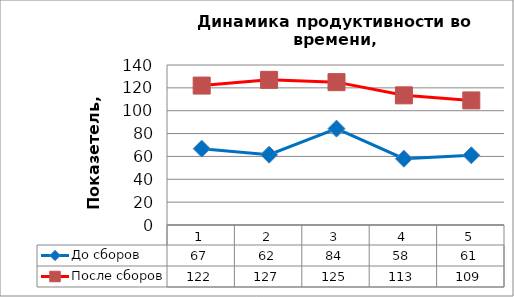
| Category | До сборов | После сборов |
|---|---|---|
| 0 | 66.786 | 122 |
| 1 | 61.524 | 127 |
| 2 | 84.333 | 125 |
| 3 | 58 | 113.462 |
| 4 | 61 | 109 |